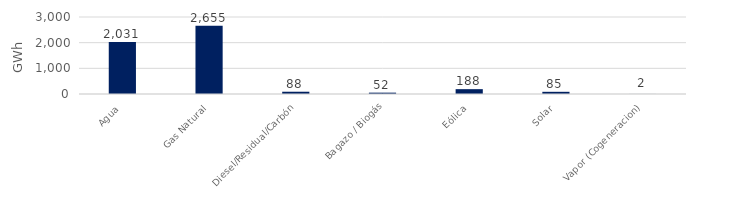
| Category | Series 0 |
|---|---|
| Agua | 2030.573 |
| Gas Natural | 2654.955 |
| Diesel/Residual/Carbón | 88.377 |
| Bagazo / Biogás | 52.497 |
| Eólica | 188.456 |
| Solar | 85.328 |
| Vapor (Cogeneracion) | 1.685 |